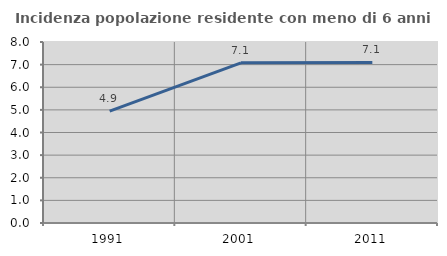
| Category | Incidenza popolazione residente con meno di 6 anni |
|---|---|
| 1991.0 | 4.949 |
| 2001.0 | 7.078 |
| 2011.0 | 7.098 |